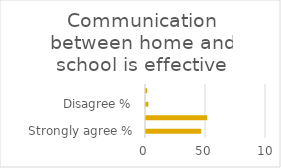
| Category | Series 1 |
|---|---|
| Strongly agree % | 46 |
| Agree % | 51 |
| Disagree % | 2 |
| Strongly disagree % | 1 |